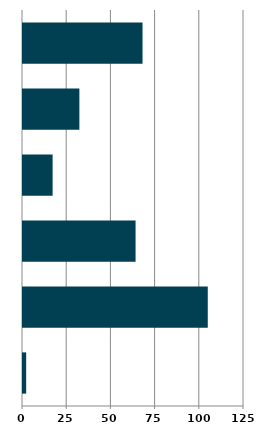
| Category | Series 0 |
|---|---|
| 0 | 1.799 |
| 1 | 104.509 |
| 2 | 63.673 |
| 3 | 16.748 |
| 4 | 31.889 |
| 5 | 67.605 |